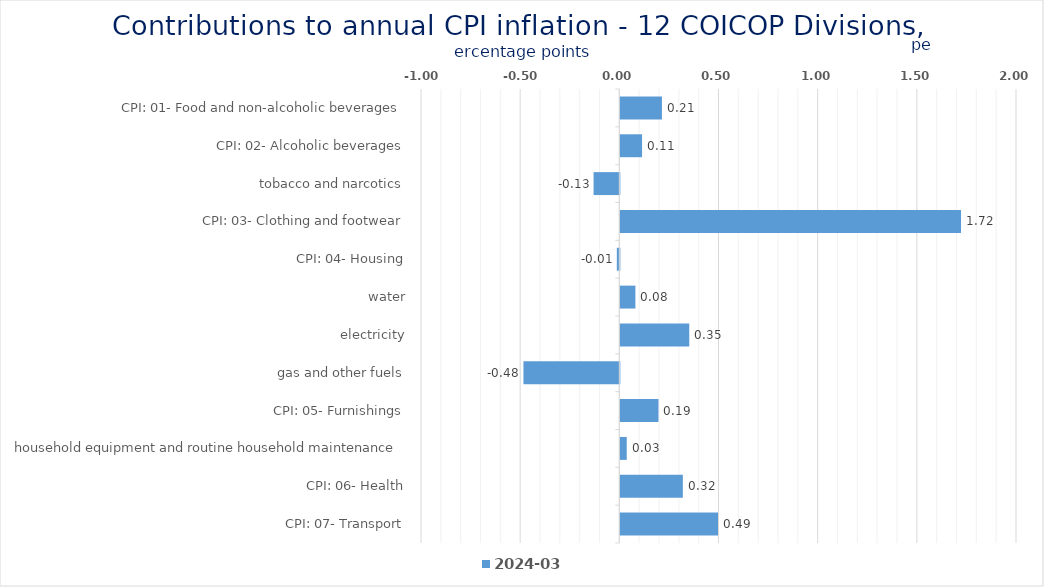
| Category | 2024-03 |
|---|---|
| CPI: 01- Food and non-alcoholic beverages | 0.21 |
| CPI: 02- Alcoholic beverages, tobacco and narcotics | 0.11 |
| CPI: 03- Clothing and footwear | -0.13 |
| CPI: 04- Housing, water, electricity, gas and other fuels | 1.718 |
| CPI: 05- Furnishings, household equipment and routine household maintenance | -0.013 |
| CPI: 06- Health | 0.076 |
| CPI: 07- Transport | 0.348 |
| CPI: 08- Communication | -0.483 |
| CPI: 09- Recreation and culture | 0.192 |
| CPI: 10- Education | 0.032 |
| CPI: 11- Restaurants and hotels | 0.315 |
| CPI: 12- Miscellaneous goods and services | 0.492 |